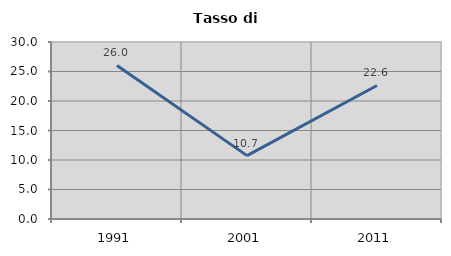
| Category | Tasso di disoccupazione   |
|---|---|
| 1991.0 | 26.026 |
| 2001.0 | 10.741 |
| 2011.0 | 22.631 |